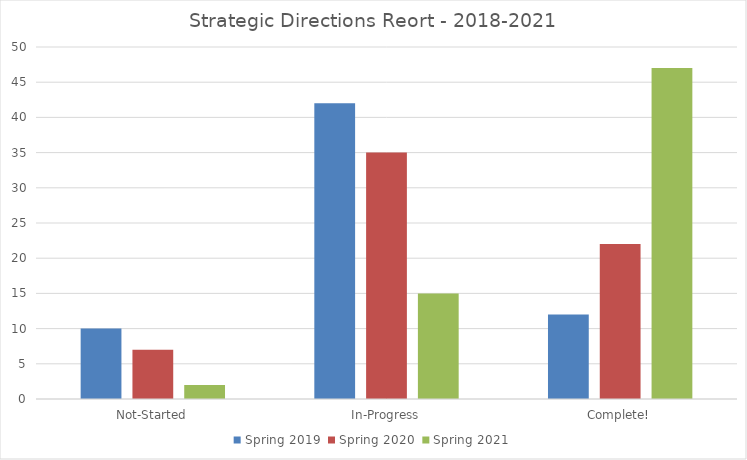
| Category | Spring 2019 | Spring 2020 | Spring 2021 |
|---|---|---|---|
| Not-Started | 10 | 7 | 2 |
| In-Progress | 42 | 35 | 15 |
| Complete! | 12 | 22 | 47 |